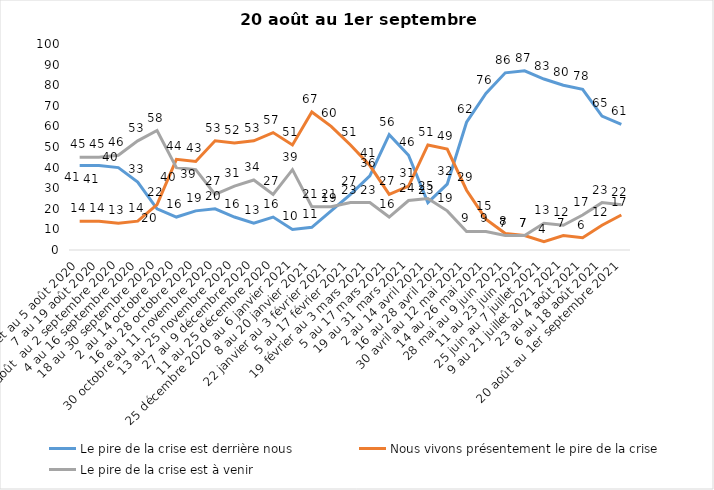
| Category | Le pire de la crise est derrière nous | Nous vivons présentement le pire de la crise | Le pire de la crise est à venir |
|---|---|---|---|
| 24 juillet au 5 août 2020 | 41 | 14 | 45 |
| 7 au 19 août 2020 | 41 | 14 | 45 |
| 21 août  au 2 septembre 2020 | 40 | 13 | 46 |
| 4 au 16 septembre 2020 | 33 | 14 | 53 |
| 18 au 30 septembre 2020 | 20 | 22 | 58 |
| 2 au 14 octobre 2020 | 16 | 44 | 40 |
| 16 au 28 octobre 2020 | 19 | 43 | 39 |
| 30 octobre au 11 novembre 2020 | 20 | 53 | 27 |
| 13 au 25 novembre 2020 | 16 | 52 | 31 |
| 27 au 9 décembre 2020 | 13 | 53 | 34 |
| 11 au 25 décembre 2020 | 16 | 57 | 27 |
| 25 décembre 2020 au 6 janvier 2021 | 10 | 51 | 39 |
| 8 au 20 janvier 2021 | 11 | 67 | 21 |
| 22 janvier au 3 février 2021 | 19 | 60 | 21 |
| 5 au 17 février 2021 | 27 | 51 | 23 |
| 19 février au 3 mars 2021 | 36 | 41 | 23 |
| 5 au 17 mars 2021 | 56 | 27 | 16 |
| 19 au 31 mars 2021 | 46 | 31 | 24 |
| 2 au 14 avril 2021 | 23 | 51 | 25 |
| 16 au 28 avril 2021 | 32 | 49 | 19 |
| 30 avril au 12 mai 2021 | 62 | 29 | 9 |
| 14 au 26 mai 2021 | 76 | 15 | 9 |
| 28 mai au 9 juin 2021 | 86 | 8 | 7 |
| 11 au 23 juin 2021 | 87 | 7 | 7 |
| 25 juin au 7 juillet 2021 | 83 | 4 | 13 |
| 9 au 21 juillet 2021 2021 | 80 | 7 | 12 |
| 23 au 4 août 2021 | 78 | 6 | 17 |
| 6 au 18 août 2021 | 65 | 12 | 23 |
| 20 août au 1er septembre 2021 | 61 | 17 | 22 |